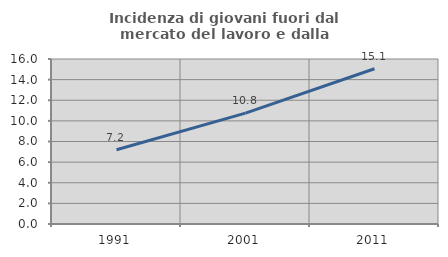
| Category | Incidenza di giovani fuori dal mercato del lavoro e dalla formazione  |
|---|---|
| 1991.0 | 7.2 |
| 2001.0 | 10.753 |
| 2011.0 | 15.054 |